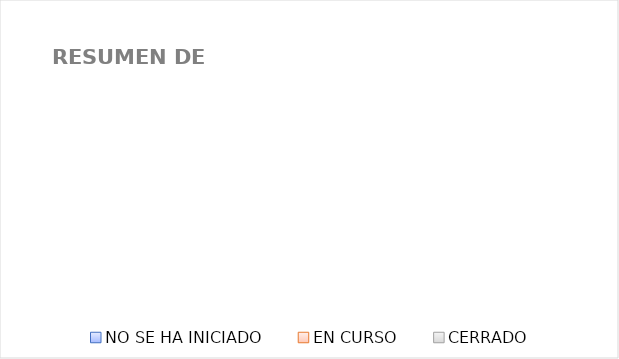
| Category | Series 0 |
|---|---|
| NO SE HA INICIADO | 0 |
| EN CURSO | 0 |
| CERRADO | 0 |